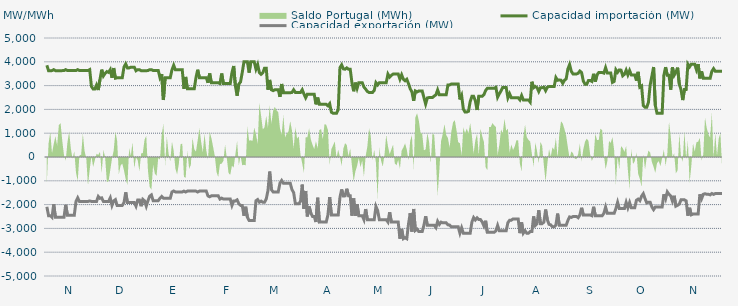
| Category | Capacidad importación (MW) | Capacidad exportación (MW) |
|---|---|---|
| 0 | 3854.167 | -2091.667 |
| 1900-01-01 | 3625 | -2466.667 |
| 1900-01-02 | 3625 | -2466.667 |
| 1900-01-03 | 3629.167 | -2533.333 |
| 1900-01-04 | 3670.833 | -1987.5 |
| 1900-01-05 | 3629.167 | -2533.333 |
| 1900-01-06 | 3629.167 | -2533.333 |
| 1900-01-07 | 3629.167 | -2533.333 |
| 1900-01-08 | 3629.167 | -2533.333 |
| 1900-01-09 | 3629.167 | -2533.333 |
| 1900-01-10 | 3633.333 | -2533.333 |
| 1900-01-11 | 3670.833 | -2008.333 |
| 1900-01-12 | 3633.333 | -2450 |
| 1900-01-13 | 3633.333 | -2450 |
| 1900-01-14 | 3633.333 | -2450 |
| 1900-01-15 | 3633.333 | -2450 |
| 1900-01-16 | 3633.333 | -2450 |
| 1900-01-17 | 3633.333 | -1866.667 |
| 1900-01-18 | 3670.833 | -1716.667 |
| 1900-01-19 | 3633.333 | -1866.667 |
| 1900-01-20 | 3633.333 | -1866.667 |
| 1900-01-21 | 3633.333 | -1866.667 |
| 1900-01-22 | 3633.333 | -1866.667 |
| 1900-01-23 | 3633.333 | -1866.667 |
| 1900-01-24 | 3633.333 | -1866.667 |
| 1900-01-25 | 3670.833 | -1845.833 |
| 1900-01-26 | 2966.667 | -1866.667 |
| 1900-01-27 | 2858.333 | -1866.667 |
| 1900-01-28 | 2858.333 | -1866.667 |
| 1900-01-29 | 3025 | -1866.667 |
| 1900-01-30 | 2812.5 | -1658.333 |
| 1900-01-31 | 3262.5 | -1737.5 |
| 1900-02-01 | 3670.833 | -1716.667 |
| 1900-02-02 | 3404.167 | -1866.667 |
| 1900-02-03 | 3512.5 | -1866.667 |
| 1900-02-04 | 3589.583 | -1866.667 |
| 1900-02-05 | 3556.25 | -1866.667 |
| 1900-02-06 | 3670.833 | -1716.667 |
| 1900-02-07 | 3329.167 | -2033.333 |
| 1900-02-08 | 3737.5 | -1845.833 |
| 1900-02-09 | 3310.417 | -1791.667 |
| 1900-02-10 | 3329.167 | -2033.333 |
| 1900-02-11 | 3329.167 | -2033.333 |
| 1900-02-12 | 3329.167 | -2033.333 |
| 1900-02-13 | 3329.167 | -2033.333 |
| 1900-02-14 | 3775 | -1916.667 |
| 1900-02-15 | 3912.5 | -1485.417 |
| 1900-02-16 | 3743.75 | -1916.667 |
| 1900-02-17 | 3743.75 | -1916.667 |
| 1900-02-18 | 3775 | -1916.667 |
| 1900-02-19 | 3775 | -1916.667 |
| 1900-02-20 | 3775 | -1916.667 |
| 1900-02-21 | 3625 | -2066.667 |
| 1900-02-22 | 3670.833 | -1804.167 |
| 1900-02-23 | 3670.833 | -1804.167 |
| 1900-02-24 | 3625 | -2066.667 |
| 1900-02-25 | 3625 | -1779.167 |
| 1900-02-26 | 3625 | -1841.667 |
| 1900-02-27 | 3625 | -2066.667 |
| 1900-02-28 | 3633.333 | -1833.333 |
| 1900-02-28 | 3670.833 | -1645.833 |
| 1900-03-01 | 3670.833 | -1591.667 |
| 1900-03-02 | 3633.333 | -1833.333 |
| 1900-03-03 | 3633.333 | -1833.333 |
| 1900-03-04 | 3633.333 | -1833.333 |
| 1900-03-05 | 3633.333 | -1833.333 |
| 1900-03-06 | 3333.333 | -1733.333 |
| 1900-03-07 | 3483.333 | -1658.333 |
| 1900-03-08 | 2393.75 | -1733.333 |
| 1900-03-09 | 3333.333 | -1733.333 |
| 1900-03-10 | 3333.333 | -1733.333 |
| 1900-03-11 | 3333.333 | -1733.333 |
| 1900-03-12 | 3333.333 | -1733.333 |
| 1900-03-13 | 3662.5 | -1466.667 |
| 1900-03-14 | 3854.167 | -1429.167 |
| 1900-03-15 | 3662.5 | -1466.667 |
| 1900-03-16 | 3662.5 | -1466.667 |
| 1900-03-17 | 3662.5 | -1466.667 |
| 1900-03-18 | 3662.5 | -1466.667 |
| 1900-03-19 | 3662.5 | -1466.667 |
| 1900-03-20 | 2862.5 | -1433.333 |
| 1900-03-21 | 3364.583 | -1470.833 |
| 1900-03-22 | 2862.5 | -1433.333 |
| 1900-03-23 | 2862.5 | -1433.333 |
| 1900-03-24 | 2862.5 | -1433.333 |
| 1900-03-25 | 2862.5 | -1433.333 |
| 1900-03-26 | 2862.5 | -1433.333 |
| 1900-03-27 | 3333.333 | -1433.333 |
| 1900-03-28 | 3666.667 | -1470.833 |
| 1900-03-29 | 3333.333 | -1433.333 |
| 1900-03-30 | 3333.333 | -1433.333 |
| 1900-03-31 | 3333.333 | -1433.333 |
| 1900-04-01 | 3333.333 | -1433.333 |
| 1900-04-02 | 3333.333 | -1433.333 |
| 1900-04-03 | 3116.667 | -1633.333 |
| 1900-04-04 | 3508.333 | -1670.833 |
| 1900-04-05 | 3116.667 | -1633.333 |
| 1900-04-06 | 3116.667 | -1633.333 |
| 1900-04-07 | 3116.667 | -1633.333 |
| 1900-04-08 | 3116.667 | -1633.333 |
| 1900-04-09 | 3116.667 | -1633.333 |
| 1900-04-10 | 3087.5 | -1766.667 |
| 1900-04-11 | 3508.333 | -1729.167 |
| 1900-04-12 | 3087.5 | -1766.667 |
| 1900-04-13 | 3087.5 | -1766.667 |
| 1900-04-14 | 3087.5 | -1766.667 |
| 1900-04-15 | 3087.5 | -1766.667 |
| 1900-04-16 | 3087.5 | -1766.667 |
| 1900-04-17 | 3550 | -2033.333 |
| 1900-04-18 | 3825 | -1845.833 |
| 1900-04-19 | 2987.5 | -1845.833 |
| 1900-04-20 | 2575 | -1800 |
| 1900-04-21 | 3062.5 | -1962.5 |
| 1900-04-22 | 3154.167 | -2033.333 |
| 1900-04-23 | 3550 | -2033.333 |
| 1900-04-24 | 4000 | -2466.667 |
| 1900-04-25 | 4000 | -2091.667 |
| 1900-04-26 | 4000 | -2529.167 |
| 1900-04-27 | 3545.833 | -2666.667 |
| 1900-04-28 | 4000 | -2666.667 |
| 1900-04-29 | 4000 | -2666.667 |
| 1900-04-30 | 4000 | -2666.667 |
| 1900-05-01 | 3691.667 | -1837.5 |
| 1900-05-02 | 3883.333 | -1787.5 |
| 1900-05-03 | 3545.833 | -1900 |
| 1900-05-04 | 3475 | -1854.167 |
| 1900-05-05 | 3537.5 | -1900 |
| 1900-05-06 | 3733.333 | -1900 |
| 1900-05-07 | 3733.333 | -1762.5 |
| 1900-05-08 | 2825 | -1416.667 |
| 1900-05-09 | 3237.5 | -612.5 |
| 1900-05-10 | 2825 | -1370.833 |
| 1900-05-11 | 2787.5 | -1466.667 |
| 1900-05-12 | 2825 | -1466.667 |
| 1900-05-13 | 2825 | -1466.667 |
| 1900-05-14 | 2825 | -1466.667 |
| 1900-05-15 | 2529.167 | -1100 |
| 1900-05-16 | 3066.667 | -987.5 |
| 1900-05-17 | 2700 | -1100 |
| 1900-05-18 | 2700 | -1100 |
| 1900-05-19 | 2700 | -1100 |
| 1900-05-20 | 2700 | -1100 |
| 1900-05-21 | 2700 | -1100 |
| 1900-05-22 | 2712.5 | -1368.75 |
| 1900-05-23 | 2823.913 | -1495.652 |
| 1900-05-24 | 2712.5 | -1966.667 |
| 1900-05-25 | 2712.5 | -1966.667 |
| 1900-05-26 | 2712.5 | -1966.667 |
| 1900-05-27 | 2712.5 | -1862.5 |
| 1900-05-28 | 2827.083 | -1160.417 |
| 1900-05-29 | 2645.833 | -2179.167 |
| 1900-05-30 | 2487.5 | -1427.083 |
| 1900-05-31 | 2639.583 | -2495.833 |
| 1900-06-01 | 2633.333 | -2079.167 |
| 1900-06-02 | 2633.333 | -2350 |
| 1900-06-03 | 2633.333 | -2500 |
| 1900-06-04 | 2633.333 | -2500 |
| 1900-06-05 | 2212.5 | -2733.333 |
| 1900-06-06 | 2495.833 | -1712.5 |
| 1900-06-07 | 2212.5 | -2733.333 |
| 1900-06-08 | 2212.5 | -2725 |
| 1900-06-09 | 2212.5 | -2733.333 |
| 1900-06-10 | 2212.5 | -2733.333 |
| 1900-06-11 | 2212.5 | -2733.333 |
| 1900-06-12 | 2150 | -2433.333 |
| 1900-06-13 | 2241.667 | -1683.333 |
| 1900-06-14 | 1883.333 | -2433.333 |
| 1900-06-15 | 1837.5 | -2433.333 |
| 1900-06-16 | 1837.5 | -2433.333 |
| 1900-06-17 | 1837.5 | -2433.333 |
| 1900-06-18 | 1987.5 | -2433.333 |
| 1900-06-19 | 3754.167 | -1700 |
| 1900-06-20 | 3870.833 | -1362.5 |
| 1900-06-21 | 3704.167 | -1637.5 |
| 1900-06-22 | 3687.5 | -1633.333 |
| 1900-06-23 | 3743.75 | -1333.333 |
| 1900-06-24 | 3687.5 | -1633.333 |
| 1900-06-25 | 3687.5 | -1633.333 |
| 1900-06-26 | 3125 | -2466.667 |
| 1900-06-27 | 2762.5 | -1741.667 |
| 1900-06-28 | 3125 | -2466.667 |
| 1900-06-29 | 2881.25 | -1979.167 |
| 1900-06-30 | 3125 | -2466.667 |
| 1900-07-01 | 3125 | -2466.667 |
| 1900-07-02 | 3125 | -2466.667 |
| 1900-07-03 | 2941.667 | -2633.333 |
| 1900-07-04 | 2852.083 | -2187.5 |
| 1900-07-05 | 2752.083 | -2633.333 |
| 1900-07-06 | 2712.5 | -2633.333 |
| 1900-07-07 | 2712.5 | -2633.333 |
| 1900-07-08 | 2712.5 | -2633.333 |
| 1900-07-09 | 2795.833 | -2633.333 |
| 1900-07-10 | 3125 | -2079.583 |
| 1900-07-11 | 3029.167 | -2250 |
| 1900-07-12 | 3125 | -2633.333 |
| 1900-07-13 | 3125 | -2633.333 |
| 1900-07-14 | 3125 | -2633.333 |
| 1900-07-15 | 3125 | -2633.333 |
| 1900-07-16 | 3125 | -2633.333 |
| 1900-07-17 | 3483.333 | -2733.333 |
| 1900-07-18 | 3358.333 | -2320.833 |
| 1900-07-19 | 3429.167 | -2733.333 |
| 1900-07-20 | 3483.333 | -2733.333 |
| 1900-07-21 | 3483.333 | -2733.333 |
| 1900-07-22 | 3483.333 | -2733.333 |
| 1900-07-23 | 3483.333 | -2733.333 |
| 1900-07-24 | 3266.667 | -3433.333 |
| 1900-07-25 | 3454.167 | -3020.833 |
| 1900-07-26 | 3266.667 | -3433.333 |
| 1900-07-27 | 3204.167 | -3391.667 |
| 1900-07-28 | 3266.667 | -3433.333 |
| 1900-07-29 | 3083.333 | -2816.667 |
| 1900-07-30 | 2866.667 | -2362.5 |
| 1900-07-31 | 2737.5 | -3133.333 |
| 1900-08-01 | 2358.333 | -2183.333 |
| 1900-08-02 | 2775 | -3085.417 |
| 1900-08-03 | 2733.333 | -3029.167 |
| 1900-08-04 | 2775 | -3133.333 |
| 1900-08-05 | 2775 | -3133.333 |
| 1900-08-06 | 2775 | -3133.333 |
| 1900-08-07 | 2500 | -2866.667 |
| 1900-08-08 | 2225 | -2491.667 |
| 1900-08-09 | 2481.25 | -2866.667 |
| 1900-08-10 | 2500 | -2866.667 |
| 1900-08-11 | 2500 | -2866.667 |
| 1900-08-12 | 2500 | -2866.667 |
| 1900-08-13 | 2562.5 | -2866.667 |
| 1900-08-14 | 2612.5 | -2966.667 |
| 1900-08-15 | 2818.75 | -2704.167 |
| 1900-08-16 | 2612.5 | -2833.333 |
| 1900-08-17 | 2612.5 | -2737.5 |
| 1900-08-18 | 2612.5 | -2766.667 |
| 1900-08-19 | 2612.5 | -2766.667 |
| 1900-08-20 | 2612.5 | -2766.667 |
| 1900-08-21 | 3025 | -2850 |
| 1900-08-22 | 3029.167 | -2858.333 |
| 1900-08-23 | 3066.667 | -2933.333 |
| 1900-08-24 | 3066.667 | -2933.333 |
| 1900-08-25 | 3066.667 | -2933.333 |
| 1900-08-26 | 3066.667 | -2933.333 |
| 1900-08-27 | 3066.667 | -2933.333 |
| 1900-08-28 | 2416.667 | -3200 |
| 1900-08-29 | 2585.417 | -2975 |
| 1900-08-30 | 2012.5 | -3200 |
| 1900-08-31 | 1887.5 | -3200 |
| 1900-09-01 | 1887.5 | -3200 |
| 1900-09-02 | 1920.833 | -3200 |
| 1900-09-03 | 2333.333 | -3200 |
| 1900-09-04 | 2550 | -2733.333 |
| 1900-09-05 | 2550 | -2545.833 |
| 1900-09-06 | 2362.5 | -2645.833 |
| 1900-09-07 | 1975 | -2558.333 |
| 1900-09-08 | 2550 | -2629.167 |
| 1900-09-09 | 2550 | -2629.167 |
| 1900-09-10 | 2550 | -2729.167 |
| 1900-09-11 | 2616.667 | -2895.833 |
| 1900-09-12 | 2793.75 | -2679.167 |
| 1900-09-13 | 2887.5 | -3166.667 |
| 1900-09-14 | 2887.5 | -3166.667 |
| 1900-09-15 | 2887.5 | -3166.667 |
| 1900-09-16 | 2887.5 | -3166.667 |
| 1900-09-17 | 2887.5 | -3166.667 |
| 1900-09-18 | 2925 | -3100 |
| 1900-09-19 | 2512.5 | -2875 |
| 1900-09-20 | 2658.333 | -3100 |
| 1900-09-21 | 2779.167 | -3100 |
| 1900-09-22 | 2925 | -3100 |
| 1900-09-23 | 2925 | -3100 |
| 1900-09-24 | 2925 | -3100 |
| 1900-09-25 | 2487.5 | -2758.333 |
| 1900-09-26 | 2656.25 | -2658.333 |
| 1900-09-27 | 2487.5 | -2654.167 |
| 1900-09-28 | 2487.5 | -2600 |
| 1900-09-29 | 2487.5 | -2600 |
| 1900-09-30 | 2487.5 | -2600 |
| 1900-10-01 | 2487.5 | -2600 |
| 1900-10-02 | 2400 | -3200 |
| 1900-10-03 | 2583.333 | -2750 |
| 1900-10-04 | 2400 | -3200 |
| 1900-10-05 | 2400 | -3100 |
| 1900-10-06 | 2400 | -3200 |
| 1900-10-07 | 2400 | -3200 |
| 1900-10-08 | 2308.333 | -3133.333 |
| 1900-10-09 | 3162.5 | -3133.333 |
| 1900-10-10 | 2910.417 | -2495.833 |
| 1900-10-11 | 2962.5 | -2875 |
| 1900-10-12 | 2912.5 | -2800 |
| 1900-10-13 | 2752.083 | -2237.5 |
| 1900-10-14 | 2912.5 | -2800 |
| 1900-10-15 | 2912.5 | -2800 |
| 1900-10-16 | 2933.333 | -2733.333 |
| 1900-10-17 | 2787.5 | -2208.333 |
| 1900-10-18 | 2929.167 | -2633.333 |
| 1900-10-19 | 2962.5 | -2829.167 |
| 1900-10-20 | 2962.5 | -2850 |
| 1900-10-21 | 2962.5 | -2933.333 |
| 1900-10-22 | 2962.5 | -2933.333 |
| 1900-10-23 | 3337.5 | -2866.667 |
| 1900-10-24 | 3222.917 | -2379.167 |
| 1900-10-25 | 3237.5 | -2866.667 |
| 1900-10-26 | 3225 | -2866.667 |
| 1900-10-27 | 3095.833 | -2866.667 |
| 1900-10-28 | 3225 | -2866.667 |
| 1900-10-29 | 3281.25 | -2866.667 |
| 1900-10-30 | 3700 | -2666.667 |
| 1900-10-31 | 3883.333 | -2516.667 |
| 1900-11-01 | 3600 | -2537.5 |
| 1900-11-02 | 3487.5 | -2500 |
| 1900-11-03 | 3487.5 | -2500 |
| 1900-11-04 | 3487.5 | -2500 |
| 1900-11-05 | 3518.75 | -2550 |
| 1900-11-06 | 3612.5 | -2433.333 |
| 1900-11-07 | 3543.75 | -2133.333 |
| 1900-11-08 | 3193.75 | -2433.333 |
| 1900-11-09 | 3060.417 | -2433.333 |
| 1900-11-10 | 3059.167 | -2433.333 |
| 1900-11-11 | 3212.5 | -2433.333 |
| 1900-11-12 | 3212.5 | -2433.333 |
| 1900-11-13 | 3175 | -2466.667 |
| 1900-11-14 | 3495.833 | -2091.667 |
| 1900-11-15 | 3166.667 | -2466.667 |
| 1900-11-16 | 3454.167 | -2466.667 |
| 1900-11-17 | 3550 | -2466.667 |
| 1900-11-18 | 3550 | -2466.667 |
| 1900-11-19 | 3550 | -2466.667 |
| 1900-11-20 | 3525 | -2366.667 |
| 1900-11-21 | 3754.167 | -2104.167 |
| 1900-11-22 | 3525 | -2366.667 |
| 1900-11-23 | 3525 | -2366.667 |
| 1900-11-24 | 3525 | -2366.667 |
| 1900-11-25 | 3135 | -2366.667 |
| 1900-11-26 | 3175 | -2366.667 |
| 1900-11-27 | 3666.667 | -2166.667 |
| 1900-11-28 | 3558.333 | -1904.167 |
| 1900-11-29 | 3658.333 | -2166.667 |
| 1900-11-30 | 3650 | -2166.667 |
| 1900-12-01 | 3412.5 | -2166.667 |
| 1900-12-02 | 3475 | -2166.667 |
| 1900-12-03 | 3650 | -1904.167 |
| 1900-12-04 | 3450 | -2133.333 |
| 1900-12-05 | 3633.333 | -1912.5 |
| 1900-12-06 | 3450 | -2133.333 |
| 1900-12-07 | 3450 | -2133.333 |
| 1900-12-08 | 3450 | -2133.333 |
| 1900-12-09 | 3210.417 | -1816.667 |
| 1900-12-10 | 3577.083 | -1766.667 |
| 1900-12-11 | 2937.5 | -1833.333 |
| 1900-12-12 | 2985.417 | -1645.833 |
| 1900-12-13 | 2162.5 | -1541.667 |
| 1900-12-14 | 2087.5 | -1745.833 |
| 1900-12-15 | 2087.5 | -1929.167 |
| 1900-12-16 | 2295.833 | -1900 |
| 1900-12-17 | 3025 | -1900 |
| 1900-12-18 | 3395.833 | -2100 |
| 1900-12-19 | 3781.25 | -2212.5 |
| 1900-12-20 | 2170.833 | -2100 |
| 1900-12-21 | 1837.5 | -2100 |
| 1900-12-22 | 1837.5 | -2100 |
| 1900-12-23 | 1837.5 | -2100 |
| 1900-12-24 | 1837.5 | -2100 |
| 1900-12-25 | 3433.333 | -1566.667 |
| 1900-12-26 | 3776 | -1760 |
| 1900-12-27 | 3433.333 | -1466.667 |
| 1900-12-28 | 3433.333 | -1566.667 |
| 1900-12-29 | 2829.167 | -1633.333 |
| 1900-12-30 | 3766.667 | -1854.167 |
| 1900-12-31 | 3433.333 | -1629.167 |
| 1901-01-01 | 3562.5 | -2066.667 |
| 1901-01-02 | 3754.167 | -2029.167 |
| 1901-01-03 | 3064.583 | -1979.167 |
| 1901-01-04 | 2833.333 | -1800 |
| 1901-01-05 | 2391.667 | -1800 |
| 1901-01-06 | 2833.333 | -1800 |
| 1901-01-07 | 2833.333 | -1841.667 |
| 1901-01-08 | 3900 | -2466.667 |
| 1901-01-09 | 3787.5 | -2133.333 |
| 1901-01-10 | 3900 | -2429.167 |
| 1901-01-11 | 3900 | -2400 |
| 1901-01-12 | 3900 | -2400 |
| 1901-01-13 | 3668.75 | -2400 |
| 1901-01-14 | 3900 | -2400 |
| 1901-01-15 | 3304.167 | -1566.667 |
| 1901-01-16 | 3595.833 | -1754.167 |
| 1901-01-17 | 3304.167 | -1566.667 |
| 1901-01-18 | 3304.167 | -1541.667 |
| 1901-01-19 | 3304.167 | -1566.667 |
| 1901-01-20 | 3304.167 | -1566.667 |
| 1901-01-21 | 3304.167 | -1591.667 |
| 1901-01-22 | 3600 | -1533.333 |
| 1901-01-23 | 3712.5 | -1570.833 |
| 1901-01-24 | 3600 | -1533.333 |
| 1901-01-25 | 3600 | -1533.333 |
| 1901-01-26 | 3600 | -1533.333 |
| 1901-01-27 | 3600 | -1533.333 |
| 1901-01-28 | 3600 | -1533.333 |